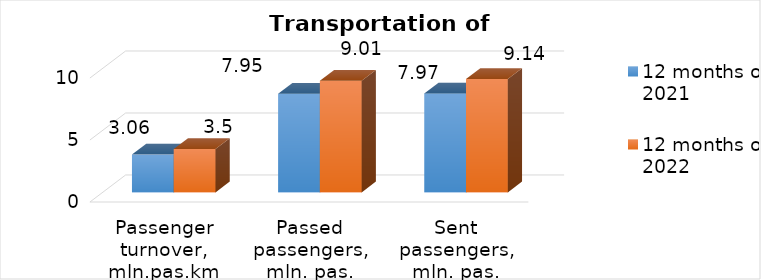
| Category | 12 months of 2021 | 12 months of 2022 |
|---|---|---|
| Passenger turnover, mln.pas.km | 3.06 | 3.5 |
| Passed passengers, mln. pas. | 7.95 | 9.01 |
| Sent passengers, mln. pas. | 7.97 | 9.14 |